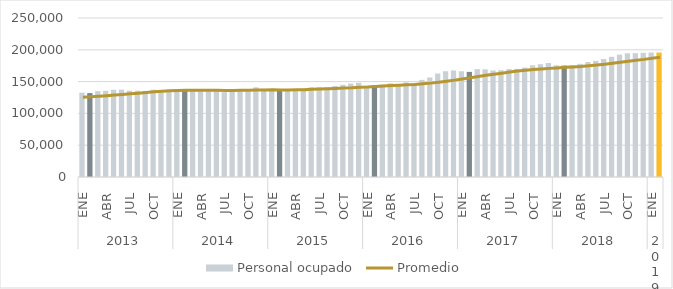
| Category | Personal ocupado |
|---|---|
| 0 | 132542 |
| 1 | 132003 |
| 2 | 134911 |
| 3 | 135436 |
| 4 | 137183 |
| 5 | 137311 |
| 6 | 135598 |
| 7 | 135693 |
| 8 | 135379 |
| 9 | 137228 |
| 10 | 136598 |
| 11 | 137134 |
| 12 | 137068 |
| 13 | 138202 |
| 14 | 135755 |
| 15 | 135620 |
| 16 | 135760 |
| 17 | 135146 |
| 18 | 133261 |
| 19 | 136395 |
| 20 | 138072 |
| 21 | 138343 |
| 22 | 140999 |
| 23 | 138657 |
| 24 | 138297 |
| 25 | 135299 |
| 26 | 136376 |
| 27 | 137921 |
| 28 | 138944 |
| 29 | 141006 |
| 30 | 141101 |
| 31 | 140867 |
| 32 | 143124 |
| 33 | 145017 |
| 34 | 146837 |
| 35 | 148110 |
| 36 | 143355 |
| 37 | 144166 |
| 38 | 145207 |
| 39 | 147078 |
| 40 | 145950 |
| 41 | 148723 |
| 42 | 147632 |
| 43 | 152741 |
| 44 | 156454 |
| 45 | 162705 |
| 46 | 166273 |
| 47 | 167561 |
| 48 | 166202 |
| 49 | 165255 |
| 50 | 169563 |
| 51 | 169234 |
| 52 | 167441 |
| 53 | 167945 |
| 54 | 169689 |
| 55 | 169933 |
| 56 | 171982 |
| 57 | 175631 |
| 58 | 177347 |
| 59 | 179261 |
| 60 | 175560 |
| 61 | 175111 |
| 62 | 175854 |
| 63 | 177884 |
| 64 | 180730 |
| 65 | 182595 |
| 66 | 185563 |
| 67 | 188966 |
| 68 | 192371 |
| 69 | 194536 |
| 70 | 194720 |
| 71 | 195275 |
| 72 | 195653 |
| 73 | 195633 |